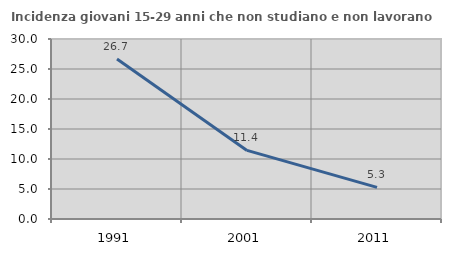
| Category | Incidenza giovani 15-29 anni che non studiano e non lavorano  |
|---|---|
| 1991.0 | 26.667 |
| 2001.0 | 11.429 |
| 2011.0 | 5.263 |